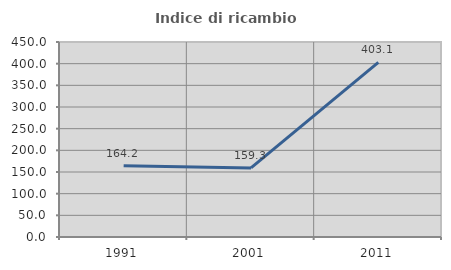
| Category | Indice di ricambio occupazionale  |
|---|---|
| 1991.0 | 164.179 |
| 2001.0 | 159.322 |
| 2011.0 | 403.077 |